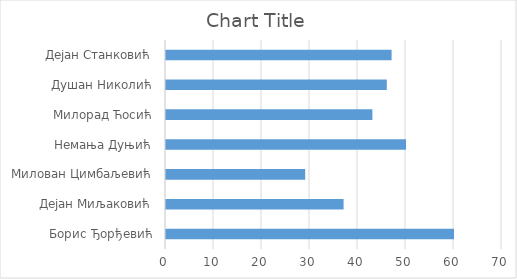
| Category | Series 0 |
|---|---|
| Борис Ђорђевић | 60 |
| Дејан Миљаковић | 37 |
| Милован Цимбаљевић | 29 |
| Немања Дуњић | 50 |
| Милорад Ћосић | 43 |
| Душан Николић | 46 |
| Дејан Станковић | 47 |